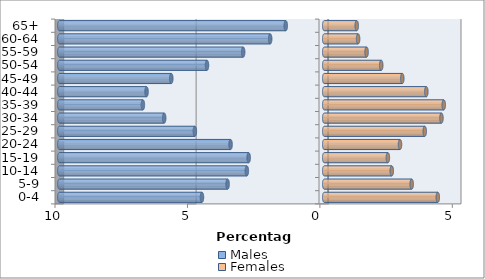
| Category | Males | Females |
|---|---|---|
| 0-4 | -4.616 | 4.287 |
| 5-9 | -3.648 | 3.302 |
| 10-14 | -2.922 | 2.55 |
| 15-19 | -2.852 | 2.403 |
| 20-24 | -3.535 | 2.861 |
| 25-29 | -4.884 | 3.795 |
| 30-34 | -6.042 | 4.426 |
| 35-39 | -6.846 | 4.512 |
| 40-44 | -6.708 | 3.855 |
| 45-49 | -5.774 | 2.948 |
| 50-54 | -4.426 | 2.152 |
| 55-59 | -3.06 | 1.599 |
| 60-64 | -2.04 | 1.279 |
| 65+ | -1.452 | 1.227 |